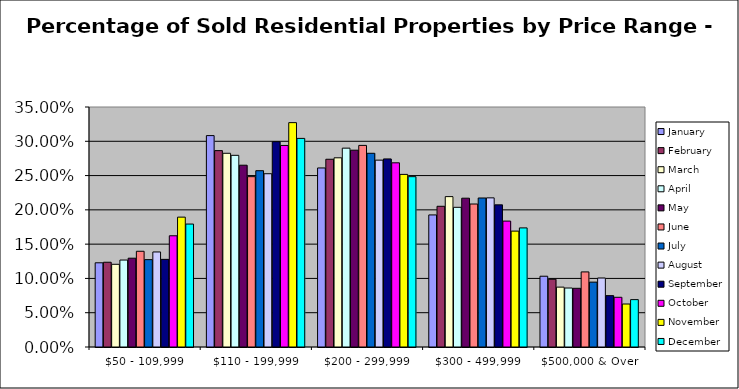
| Category | January | February | March | April | May | June | July | August | September | October | November | December |
|---|---|---|---|---|---|---|---|---|---|---|---|---|
| $50 - 109,999 | 0.123 | 0.124 | 0.121 | 0.127 | 0.13 | 0.14 | 0.127 | 0.139 | 0.128 | 0.162 | 0.189 | 0.179 |
| $110 - 199,999 | 0.308 | 0.286 | 0.282 | 0.28 | 0.265 | 0.248 | 0.257 | 0.253 | 0.299 | 0.294 | 0.327 | 0.304 |
| $200 - 299,999 | 0.261 | 0.274 | 0.276 | 0.29 | 0.287 | 0.294 | 0.282 | 0.272 | 0.274 | 0.269 | 0.252 | 0.248 |
| $300 - 499,999 | 0.193 | 0.205 | 0.219 | 0.204 | 0.217 | 0.209 | 0.217 | 0.218 | 0.207 | 0.184 | 0.169 | 0.174 |
| $500,000 & Over | 0.103 | 0.099 | 0.087 | 0.086 | 0.086 | 0.109 | 0.095 | 0.101 | 0.075 | 0.072 | 0.063 | 0.069 |